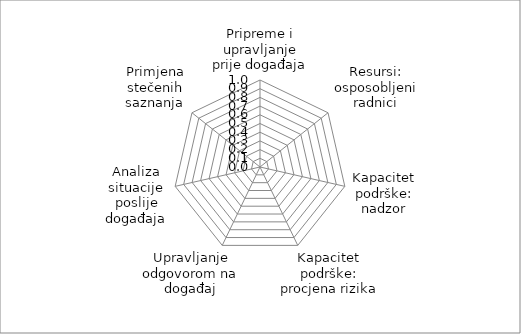
| Category | Series 0 |
|---|---|
| Pripreme i upravljanje prije događaja | 0 |
| Resursi: osposobljeni radnici | 0 |
| Kapacitet podrške: nadzor | 0 |
| Kapacitet podrške: procjena rizika | 0 |
| Upravljanje odgovorom na događaj | 0 |
| Analiza situacije poslije događaja | 0 |
| Primjena stečenih saznanja | 0 |